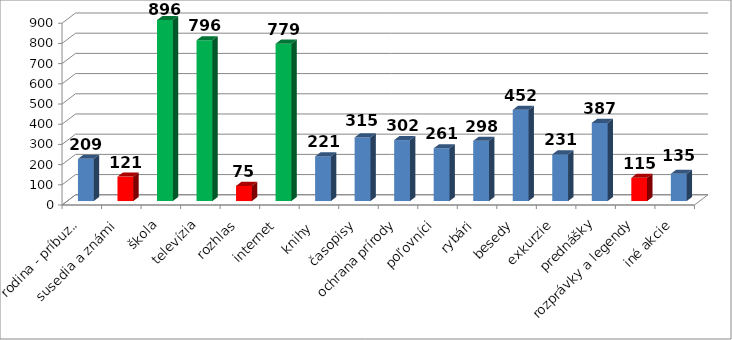
| Category | Series 0 |
|---|---|
| rodina - príbuzní | 209 |
| susedia a známi | 121 |
| škola | 896 |
| televízia | 796 |
| rozhlas | 75 |
| internet | 779 |
| knihy  | 221 |
| časopisy | 315 |
| ochrana prírody | 302 |
| poľovníci | 261 |
| rybári | 298 |
| besedy | 452 |
| exkurzie | 231 |
| prednášky | 387 |
| rozprávky a legendy | 115 |
| iné akcie | 135 |